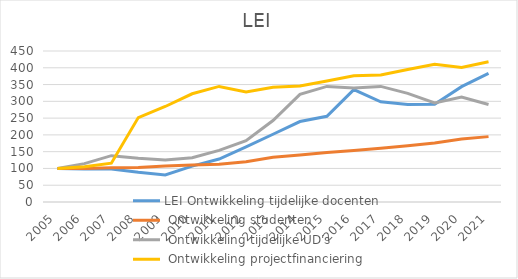
| Category | LEI |
|---|---|
| 2005.0 | 100 |
| 2006.0 | 105.263 |
| 2007.0 | 115.579 |
| 2008.0 | 251.579 |
| 2009.0 | 284.632 |
| 2010.0 | 322.526 |
| 2011.0 | 344.421 |
| 2012.0 | 328.211 |
| 2013.0 | 342.105 |
| 2014.0 | 345.474 |
| 2015.0 | 360.842 |
| 2016.0 | 376 |
| 2017.0 | 378.316 |
| 2018.0 | 394.947 |
| 2019.0 | 410.316 |
| 2020.0 | 401.053 |
| 2021.0 | 417.684 |